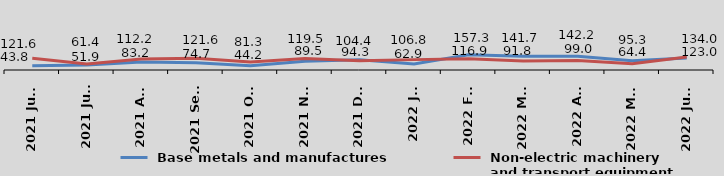
| Category |  Base metals and manufactures |  Non-electric machinery 
 and transport equipment |
|---|---|---|
| 2021 June | 43.8 | 121.6 |
| 2021 July | 51.9 | 61.4 |
| 2021 Aug | 83.2 | 112.2 |
| 2021 Sept | 74.7 | 121.6 |
| 2021 Oct | 44.2 | 81.3 |
| 2021 Nov | 89.5 | 119.5 |
| 2021 Dec | 104.4 | 94.3 |
| 2022 Jan | 62.9 | 106.8 |
| 2022 Feb | 157.3 | 116.9 |
| 2022 Mar | 141.7 | 91.8 |
| 2022 Apr | 142.2 | 99 |
| 2022 May | 95.3 | 64.4 |
| 2022 June | 123 | 134 |